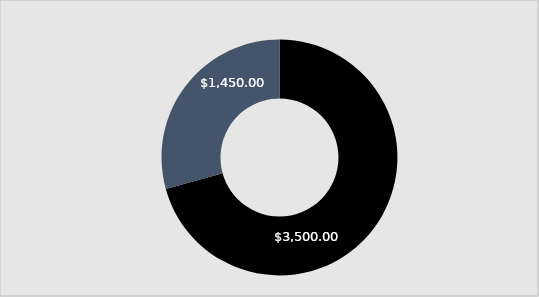
| Category | Series 0 |
|---|---|
| 0 | 3500 |
| 1 | 1450 |